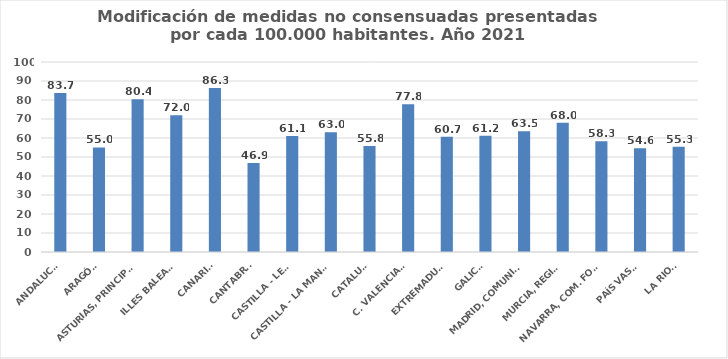
| Category | Series 0 |
|---|---|
| ANDALUCÍA | 83.659 |
| ARAGÓN | 55.042 |
| ASTURIAS, PRINCIPADO | 80.352 |
| ILLES BALEARS | 71.952 |
| CANARIAS | 86.288 |
| CANTABRIA | 46.877 |
| CASTILLA - LEÓN | 61.054 |
| CASTILLA - LA MANCHA | 63.038 |
| CATALUÑA | 55.762 |
| C. VALENCIANA | 77.795 |
| EXTREMADURA | 60.689 |
| GALICIA | 61.247 |
| MADRID, COMUNIDAD | 63.499 |
| MURCIA, REGIÓN | 67.962 |
| NAVARRA, COM. FORAL | 58.349 |
| PAÍS VASCO | 54.607 |
| LA RIOJA | 55.348 |